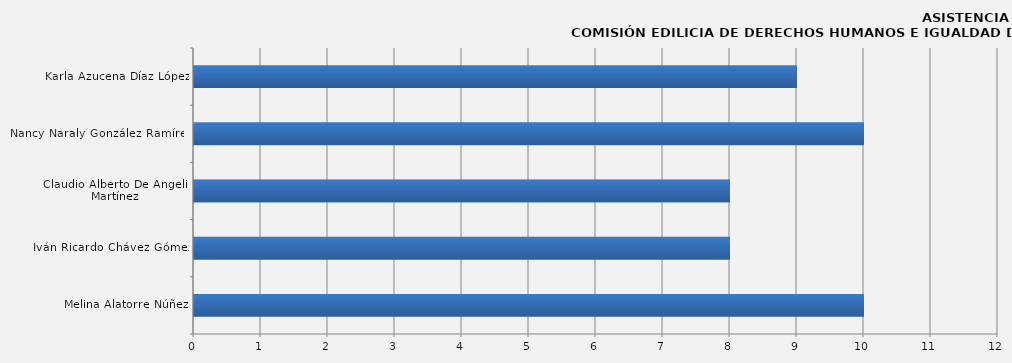
| Category | Series 0 |
|---|---|
| Melina Alatorre Núñez | 10 |
| Iván Ricardo Chávez Gómez | 8 |
| Claudio Alberto De Angelis Martínez | 8 |
| Nancy Naraly González Ramírez | 10 |
| Karla Azucena Díaz López | 9 |